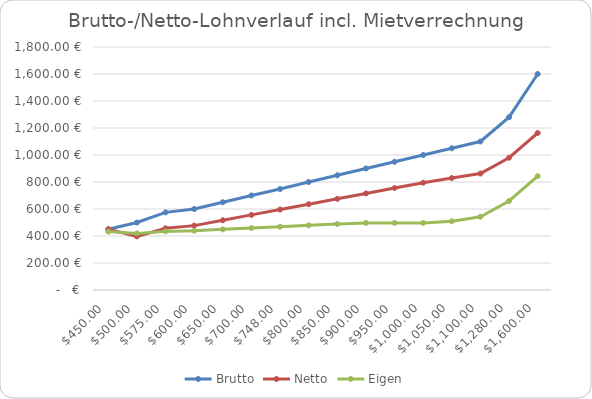
| Category | Brutto | Netto | Eigen |
|---|---|---|---|
| 450.0 | 450 | 450 | 432.5 |
| 500.0 | 500 | 397.38 | 419.35 |
| 575.0 | 575 | 456.98 | 434.25 |
| 600.0 | 600 | 476.854 | 439.21 |
| 650.0 | 650 | 516.59 | 449.15 |
| 700.0 | 700 | 556.33 | 459.08 |
| 748.0 | 748 | 596.06 | 469.02 |
| 800.0 | 800 | 635.8 | 478.95 |
| 850.0 | 850 | 675.54 | 488.95 |
| 900.0 | 900 | 715.28 | 497 |
| 950.0 | 950 | 755.01 | 497 |
| 1000.0 | 1000 | 794.75 | 497 |
| 1050.0 | 1050 | 829.33 | 509.33 |
| 1100.0 | 1100 | 862.82 | 542.82 |
| 1280.0 | 1280 | 979.95 | 659.55 |
| 1600.0 | 1600 | 1163 | 843 |